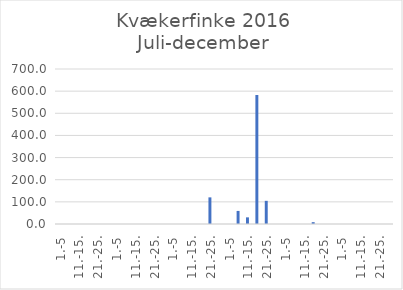
| Category | Series 0 |
|---|---|
| 1.-5 | 0 |
| 6.-10. | 0 |
| 11.-15. | 0 |
| 16.-20. | 0 |
| 21.-25. | 0 |
| 26.-31. | 0 |
| 1.-5 | 0 |
| 6.-10. | 0 |
| 11.-15. | 0 |
| 16.-20. | 0 |
| 21.-25. | 0 |
| 26.-31. | 0 |
| 1.-5 | 0 |
| 6.-10. | 0 |
| 11.-15. | 0 |
| 16.-20. | 0.028 |
| 21.-25. | 120.263 |
| 26.-30. | 0 |
| 1.-5 | 0 |
| 6.-10. | 59.032 |
| 11.-15. | 29.999 |
| 16.-20. | 582.651 |
| 21.-25. | 104.624 |
| 26.-31. | 0 |
| 1.-5 | 0 |
| 6.-10. | 0 |
| 11.-15. | 0 |
| 16.-20. | 8.297 |
| 21.-25. | 0 |
| 26.-30. | 0 |
| 1.-5 | 0 |
| 6.-10. | 0 |
| 11.-15. | 0.048 |
| 16.-20. | 0 |
| 21.-25. | 0 |
| 26.-31. | 0 |